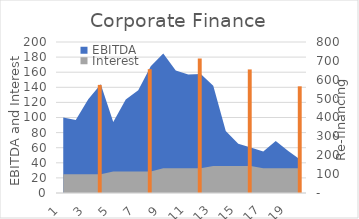
| Category | New Debt Requirement |
|---|---|
| 1.0 | 0 |
| 2.0 | 0 |
| 3.0 | 0 |
| 4.0 | 572.844 |
| 5.0 | 0 |
| 6.0 | 0 |
| 7.0 | 0 |
| 8.0 | 656 |
| 9.0 | 0 |
| 10.0 | 0 |
| 11.0 | 0 |
| 12.0 | 712.751 |
| 13.0 | 0 |
| 14.0 | 0 |
| 15.0 | 0 |
| 16.0 | 654.684 |
| 17.0 | 0 |
| 18.0 | 0 |
| 19.0 | 0 |
| 20.0 | 565.286 |